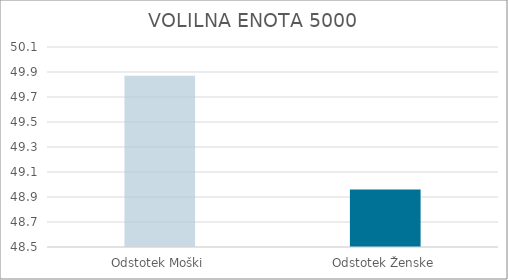
| Category | Series 0 |
|---|---|
| Odstotek Moški | 49.87 |
| Odstotek Ženske | 48.96 |